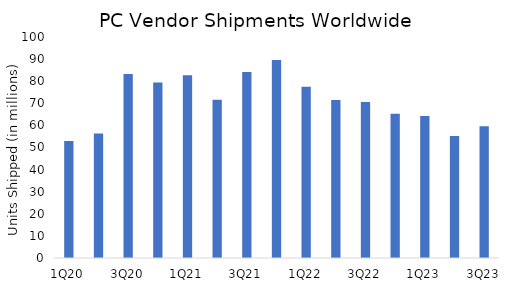
| Category | Series 0 |
|---|---|
| 1Q20 | 52.94 |
| 2Q20 | 56.33 |
| 3Q20 | 83.29 |
| 4Q20 | 79.38 |
| 1Q21 | 82.73 |
| 2Q21 | 71.65 |
| 3Q21 | 84.15 |
| 4Q21 | 89.57 |
| 1Q22 | 77.49 |
| 2Q22 | 71.52 |
| 3Q22 | 70.6 |
| 4Q22 | 65.29 |
| 1Q23 | 64.29 |
| 2Q23 | 55.15 |
| 3Q23 | 59.65 |